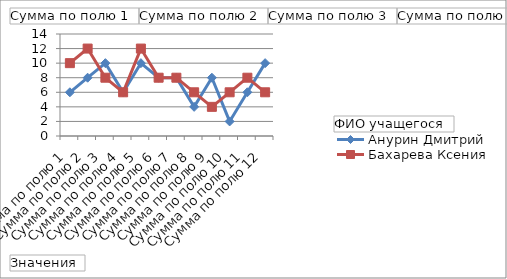
| Category | Анурин Дмитрий | Бахарева Ксения |
|---|---|---|
| Сумма по полю 1 | 6 | 10 |
| Сумма по полю 2 | 8 | 12 |
| Сумма по полю 3 | 10 | 8 |
| Сумма по полю 4 | 6 | 6 |
| Сумма по полю 5 | 10 | 12 |
| Сумма по полю 6 | 8 | 8 |
| Сумма по полю 7 | 8 | 8 |
| Сумма по полю 8 | 4 | 6 |
| Сумма по полю 9 | 8 | 4 |
| Сумма по полю 10 | 2 | 6 |
| Сумма по полю 11 | 6 | 8 |
| Сумма по полю 12 | 10 | 6 |